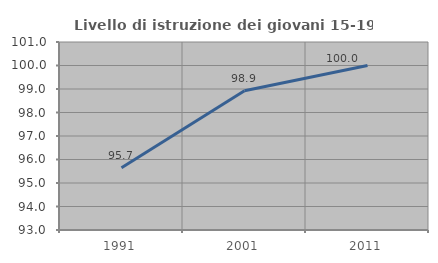
| Category | Livello di istruzione dei giovani 15-19 anni |
|---|---|
| 1991.0 | 95.652 |
| 2001.0 | 98.925 |
| 2011.0 | 100 |